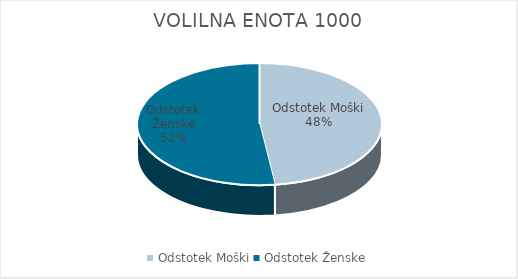
| Category | VOLILNA ENOTA 1000 |
|---|---|
| Odstotek Moški | 26.97 |
| Odstotek Ženske | 29.22 |